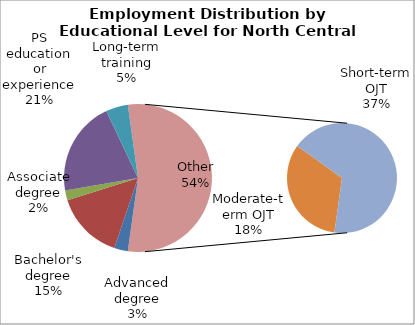
| Category | Series 0 |
|---|---|
| Advanced degree | 2750 |
| Bachelor's degree | 13760 |
| Associate degree | 1960 |
| PS education or experience | 19030 |
| Long-term training | 4450 |
| Moderate-term OJT | 16340 |
| Short-term OJT | 33720 |